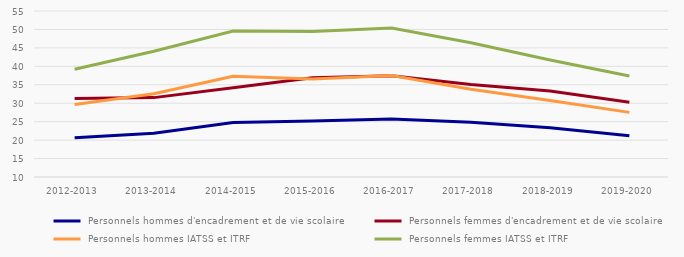
| Category |  Personnels hommes d'encadrement et de vie scolaire |  Personnels femmes d'encadrement et de vie scolaire |  Personnels hommes IATSS et ITRF |  Personnels femmes IATSS et ITRF |
|---|---|---|---|---|
| 2012-2013 | 20.61 | 31.27 | 29.64 | 39.19 |
| 2013-2014 | 21.85 | 31.52 | 32.59 | 44.1 |
| 2014-2015 | 24.76 | 34.2 | 37.29 | 49.56 |
| 2015-2016 | 25.2 | 36.9 | 36.58 | 49.46 |
| 2016-2017 | 25.72 | 37.44 | 37.54 | 50.38 |
| 2017-2018 | 24.87 | 35.08 | 33.76 | 46.4 |
| 2018-2019 | 23.34 | 33.32 | 30.75 | 41.7 |
| 2019-2020 | 21.2 | 30.28 | 27.52 | 37.4 |